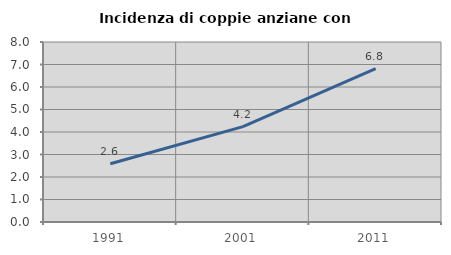
| Category | Incidenza di coppie anziane con figli |
|---|---|
| 1991.0 | 2.586 |
| 2001.0 | 4.237 |
| 2011.0 | 6.818 |